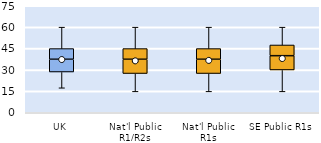
| Category | 25th | 50th | 75th |
|---|---|---|---|
| UK | 28.571 | 8.929 | 7.5 |
| Nat'l Public R1/R2s | 27.5 | 10 | 7.5 |
| Nat'l Public R1s | 27.5 | 10 | 7.5 |
| SE Public R1s | 30 | 10 | 7.5 |